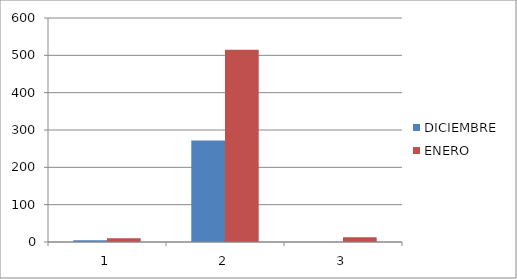
| Category | DICIEMBRE | ENERO |
|---|---|---|
| 0 | 5 | 10 |
| 1 | 272 | 515 |
| 2 | 0 | 13 |